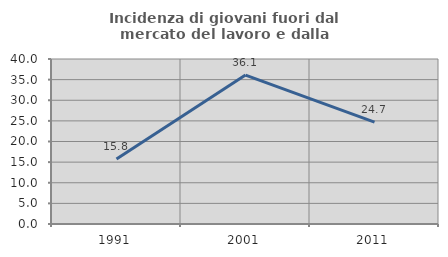
| Category | Incidenza di giovani fuori dal mercato del lavoro e dalla formazione  |
|---|---|
| 1991.0 | 15.751 |
| 2001.0 | 36.096 |
| 2011.0 | 24.711 |